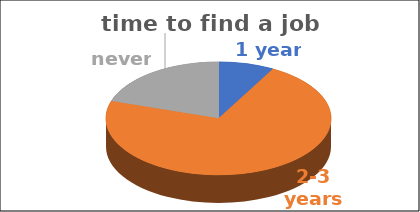
| Category | time to find a job | Series 1 | Series 2 | Series 3 | Series 4 |
|---|---|---|---|---|---|
| 1 year | 0.08 |  |  |  |  |
| 2-3 years | 0.72 |  |  |  |  |
| never | 0.2 |  |  |  |  |